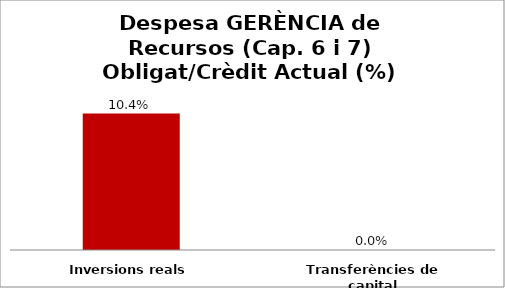
| Category | Series 0 |
|---|---|
| Inversions reals | 0.104 |
| Transferències de capital | 0 |